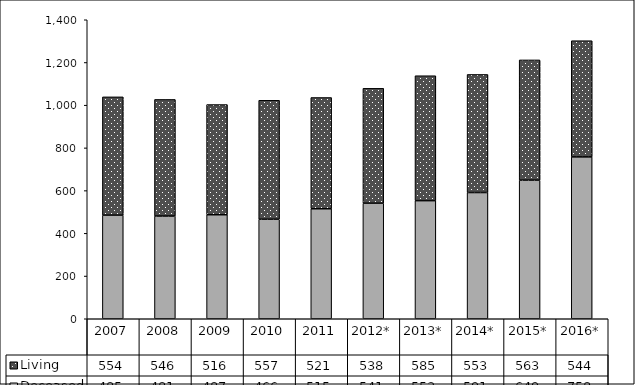
| Category | Deceased | Living |
|---|---|---|
| 2007 | 485 | 554 |
| 2008 | 481 | 546 |
| 2009 | 487 | 516 |
| 2010 | 466 | 557 |
| 2011 | 515 | 521 |
| 2012* | 541 | 538 |
| 2013* | 553 | 585 |
| 2014* | 591 | 553 |
| 2015* | 649 | 563 |
| 2016* | 758 | 544 |